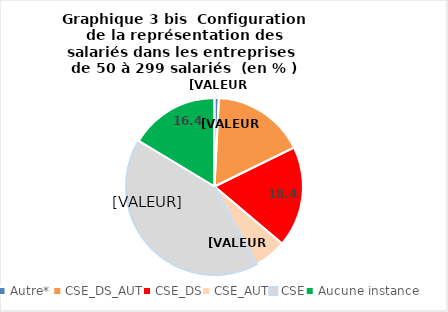
| Category | Series 0 |
|---|---|
| Autre*  | 0.79 |
| CSE_DS_AUT | 16.95 |
| CSE_DS | 18.42 |
| CSE_AUT | 5.9 |
| CSE | 41.55 |
| Aucune instance | 16.38 |